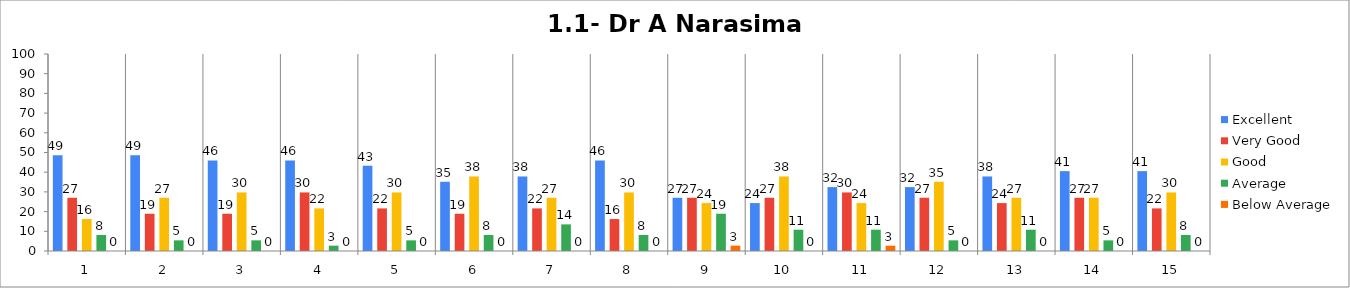
| Category | Excellent | Very Good | Good | Average | Below Average |
|---|---|---|---|---|---|
| 0 | 48.649 | 27.027 | 16.216 | 8.108 | 0 |
| 1 | 48.649 | 18.919 | 27.027 | 5.405 | 0 |
| 2 | 45.946 | 18.919 | 29.73 | 5.405 | 0 |
| 3 | 45.946 | 29.73 | 21.622 | 2.703 | 0 |
| 4 | 43.243 | 21.622 | 29.73 | 5.405 | 0 |
| 5 | 35.135 | 18.919 | 37.838 | 8.108 | 0 |
| 6 | 37.838 | 21.622 | 27.027 | 13.514 | 0 |
| 7 | 45.946 | 16.216 | 29.73 | 8.108 | 0 |
| 8 | 27.027 | 27.027 | 24.324 | 18.919 | 2.703 |
| 9 | 24.324 | 27.027 | 37.838 | 10.811 | 0 |
| 10 | 32.432 | 29.73 | 24.324 | 10.811 | 2.703 |
| 11 | 32.432 | 27.027 | 35.135 | 5.405 | 0 |
| 12 | 37.838 | 24.324 | 27.027 | 10.811 | 0 |
| 13 | 40.541 | 27.027 | 27.027 | 5.405 | 0 |
| 14 | 40.541 | 21.622 | 29.73 | 8.108 | 0 |